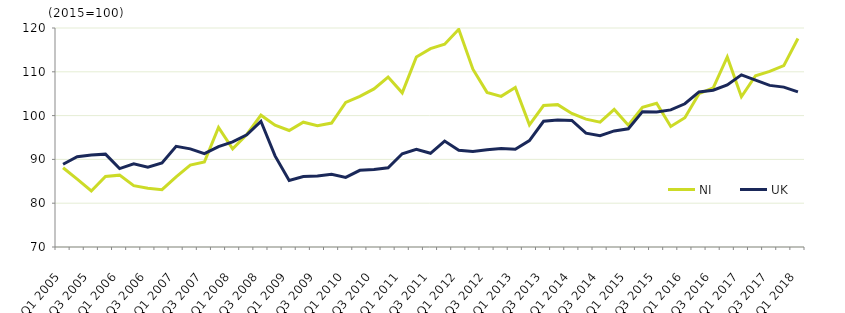
| Category | NI  | UK  |
|---|---|---|
| Q1 2005 | 88.1 | 88.9 |
|  | 85.5 | 90.6 |
| Q3 2005 | 82.8 | 91 |
|  | 86.1 | 91.2 |
| Q1 2006 | 86.4 | 87.9 |
|  | 84 | 89 |
| Q3 2006 | 83.4 | 88.2 |
|  | 83.1 | 89.2 |
| Q1 2007 | 86 | 93 |
|  | 88.7 | 92.4 |
| Q3 2007 | 89.4 | 91.3 |
|  | 97.3 | 92.9 |
| Q1 2008 | 92.4 | 94 |
|  | 95.7 | 95.6 |
| Q3 2008 | 100.1 | 98.7 |
|  | 97.8 | 90.8 |
| Q1 2009 | 96.6 | 85.2 |
|  | 98.5 | 86.1 |
| Q3 2009 | 97.7 | 86.2 |
|  | 98.3 | 86.6 |
| Q1 2010 | 103 | 85.9 |
|  | 104.4 | 87.5 |
| Q3 2010 | 106.1 | 87.7 |
|  | 108.8 | 88.1 |
| Q1 2011 | 105.2 | 91.3 |
|  | 113.4 | 92.3 |
| Q3 2011 | 115.3 | 91.4 |
|  | 116.3 | 94.2 |
| Q1 2012 | 119.7 | 92.1 |
|  | 110.6 | 91.8 |
| Q3 2012 | 105.3 | 92.2 |
|  | 104.4 | 92.5 |
| Q1 2013 | 106.4 | 92.3 |
|  | 97.9 | 94.3 |
| Q3 2013 | 102.3 | 98.7 |
|  | 102.5 | 99 |
| Q1 2014 | 100.5 | 98.9 |
|  | 99.2 | 96 |
| Q3 2014 | 98.5 | 95.4 |
|  | 101.4 | 96.5 |
| Q1 2015 | 97.8 | 97 |
|  | 101.9 | 100.9 |
| Q3 2015 | 102.8 | 100.8 |
|  | 97.5 | 101.3 |
| Q1 2016 | 99.5 | 102.7 |
|  | 105 | 105.4 |
| Q3 2016 | 106.3 | 105.8 |
|  | 113.4 | 107 |
| Q1 2017 | 104.3 | 109.3 |
|  | 109.1 | 108.1 |
| Q3 2017 | 110.1 | 106.9 |
|  | 111.4 | 106.5 |
| Q1 2018 | 117.6 | 105.4 |